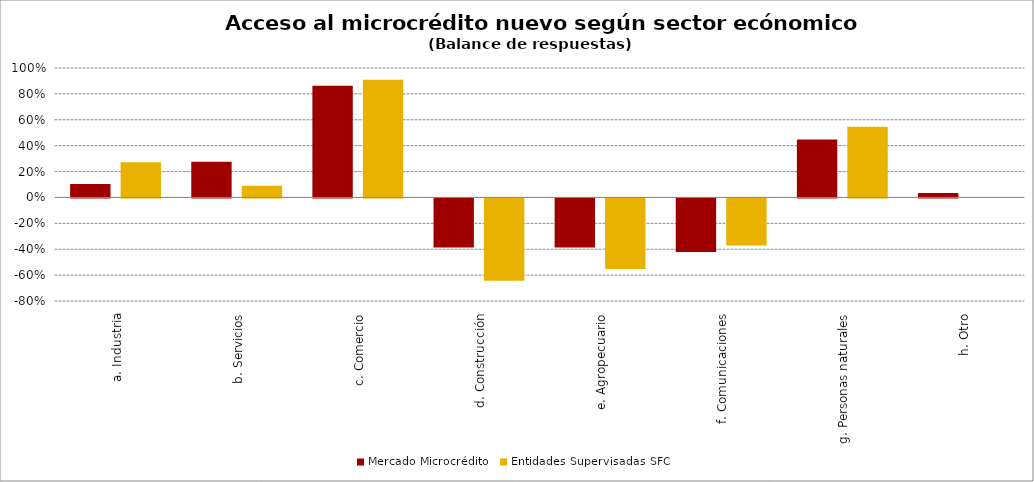
| Category | Mercado Microcrédito | Entidades Supervisadas SFC |
|---|---|---|
| a. Industria | 0.103 | 0.273 |
| b. Servicios | 0.276 | 0.091 |
| c. Comercio | 0.862 | 0.909 |
| d. Construcción | -0.379 | -0.636 |
| e. Agropecuario | -0.379 | -0.545 |
| f. Comunicaciones | -0.414 | -0.364 |
| g. Personas naturales | 0.448 | 0.545 |
| h. Otro | 0.034 | 0 |